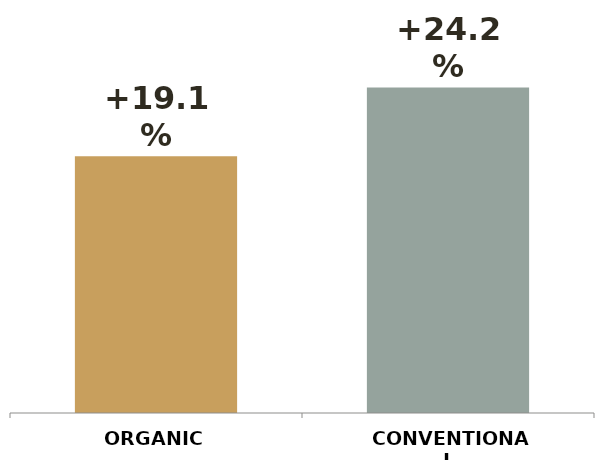
| Category | Series 0 |
|---|---|
| ORGANIC | 0.191 |
| CONVENTIONAL | 0.242 |